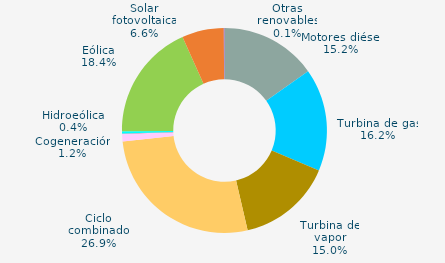
| Category | Series 0 |
|---|---|
| Motores diésel | 15.167 |
| Turbina de gas | 16.197 |
| Turbina de vapor | 15.012 |
| Ciclo combinado | 26.917 |
| Cogeneración | 1.188 |
| Hidráulica | 0.047 |
| Hidroeólica | 0.352 |
| Eólica | 18.405 |
| Solar fotovoltaica | 6.599 |
| Otras renovables | 0.115 |